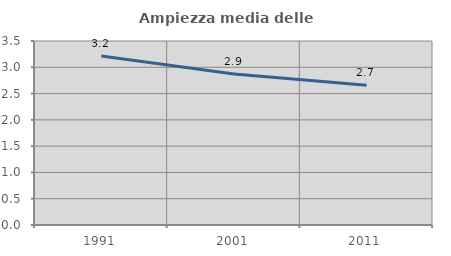
| Category | Ampiezza media delle famiglie |
|---|---|
| 1991.0 | 3.215 |
| 2001.0 | 2.874 |
| 2011.0 | 2.66 |